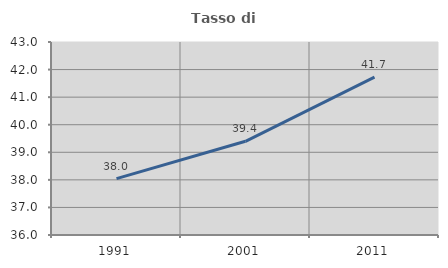
| Category | Tasso di occupazione   |
|---|---|
| 1991.0 | 38.043 |
| 2001.0 | 39.398 |
| 2011.0 | 41.726 |